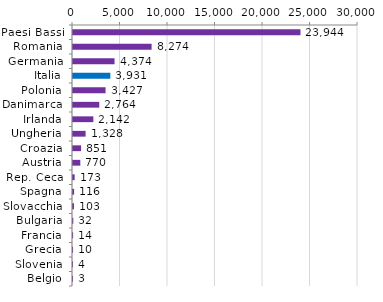
| Category | Series 0 |
|---|---|
| Paesi Bassi | 23943.76 |
| Romania | 8273.935 |
| Germania | 4373.599 |
| Italia | 3931.144 |
| Polonia | 3426.656 |
| Danimarca | 2764.411 |
| Irlanda | 2142.18 |
| Ungheria | 1328.16 |
| Croazia | 851.273 |
| Austria | 769.964 |
| Rep. Ceca | 172.538 |
| Spagna | 116.208 |
| Slovacchia | 103.074 |
| Bulgaria | 32.383 |
| Francia | 14.35 |
| Grecia | 9.56 |
| Slovenia | 4.074 |
| Belgio | 2.919 |